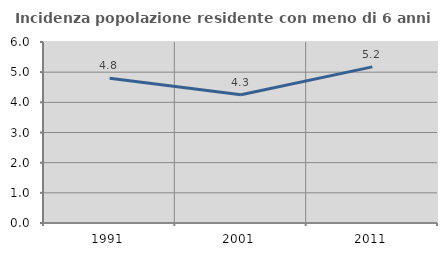
| Category | Incidenza popolazione residente con meno di 6 anni |
|---|---|
| 1991.0 | 4.796 |
| 2001.0 | 4.252 |
| 2011.0 | 5.175 |